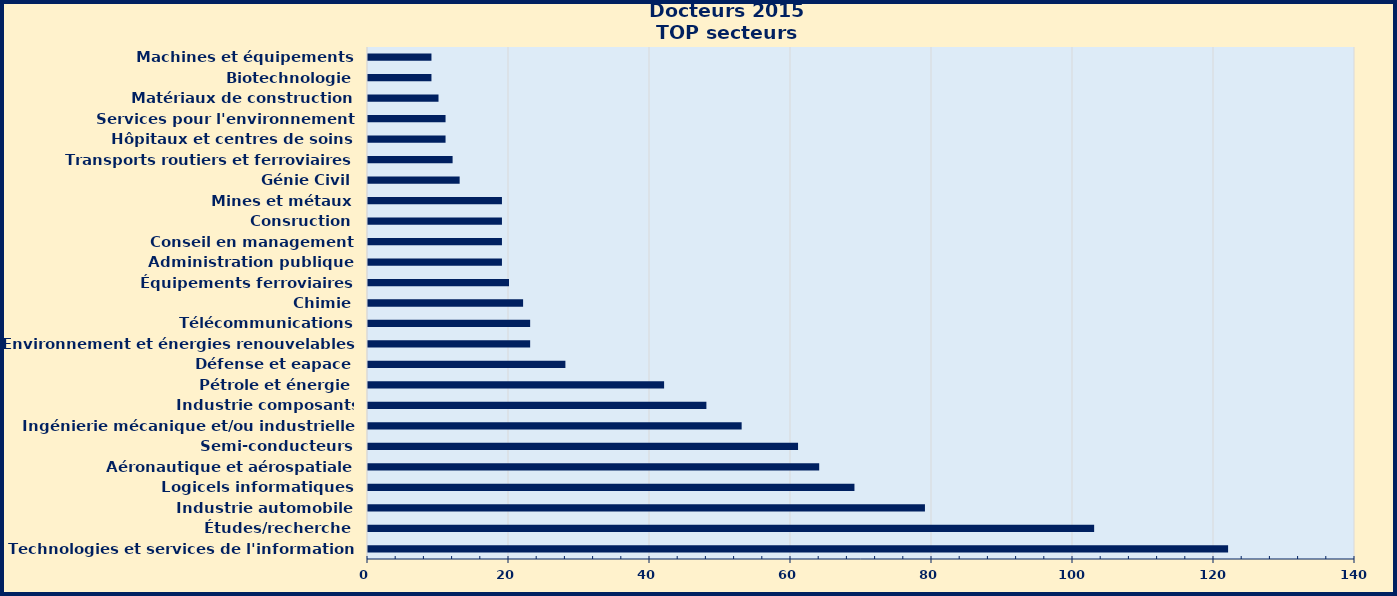
| Category | Series 0 |
|---|---|
| Technologies et services de l'information | 122 |
| Études/recherche | 103 |
| Industrie automobile | 79 |
| Logicels informatiques | 69 |
| Aéronautique et aérospatiale | 64 |
| Semi-conducteurs | 61 |
| Ingénierie mécanique et/ou industrielle | 53 |
| Industrie composants électriques/électroniques | 48 |
| Pétrole et énergie | 42 |
| Défense et eapace | 28 |
| Environnement et énergies renouvelables | 23 |
| Télécommunications | 23 |
| Chimie | 22 |
| Équipements ferroviaires | 20 |
| Administration publique | 19 |
| Conseil en management | 19 |
| Consruction | 19 |
| Mines et métaux | 19 |
| Génie Civil | 13 |
| Transports routiers et ferroviaires | 12 |
| Hôpitaux et centres de soins | 11 |
| Services pour l'environnement | 11 |
| Matériaux de construction | 10 |
| Biotechnologie | 9 |
| Machines et équipements | 9 |